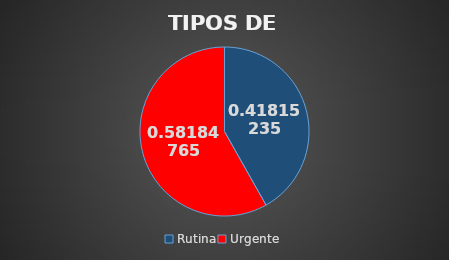
| Category | Series 0 |
|---|---|
| Rutina | 516 |
| Urgente | 718 |